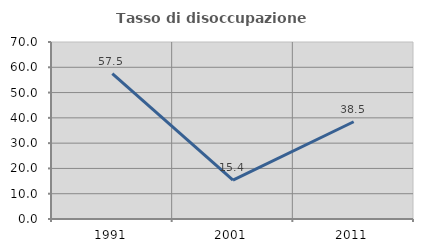
| Category | Tasso di disoccupazione giovanile  |
|---|---|
| 1991.0 | 57.5 |
| 2001.0 | 15.385 |
| 2011.0 | 38.462 |